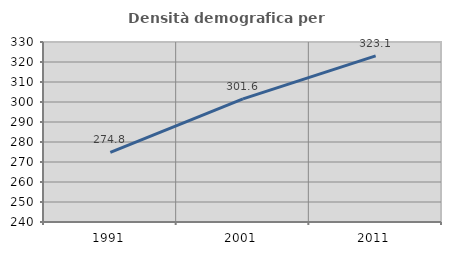
| Category | Densità demografica |
|---|---|
| 1991.0 | 274.849 |
| 2001.0 | 301.579 |
| 2011.0 | 323.091 |